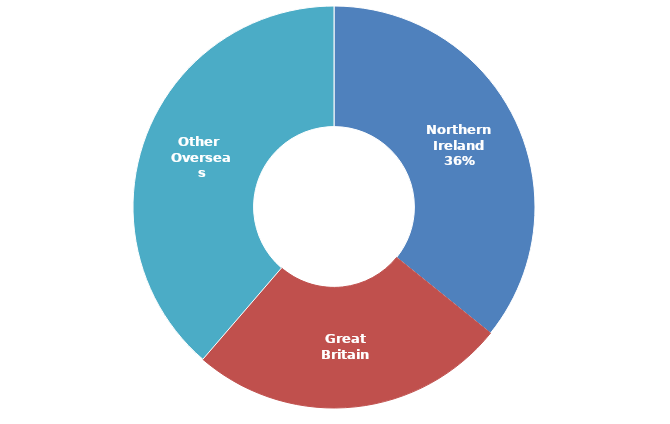
| Category | 2015 |
|---|---|
| Northern Ireland | 0.358 |
| Great Britain | 0.255 |
| Other Overseas | 0.387 |